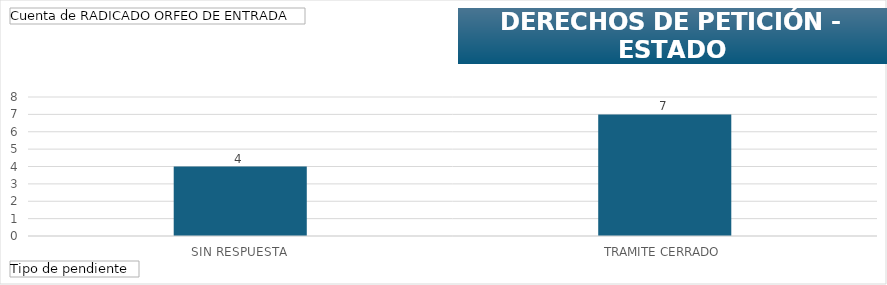
| Category | Total |
|---|---|
| SIN RESPUESTA | 4 |
| TRAMITE CERRADO | 7 |